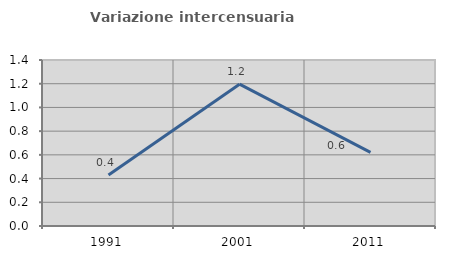
| Category | Variazione intercensuaria annua |
|---|---|
| 1991.0 | 0.43 |
| 2001.0 | 1.196 |
| 2011.0 | 0.622 |